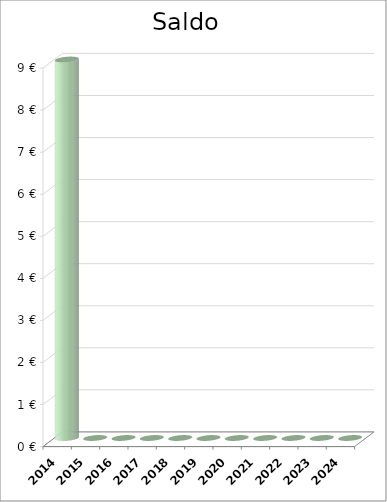
| Category | Saldo |
|---|---|
| 2014.0 | 9 |
| 2015.0 | 0 |
| 2016.0 | 0 |
| 2017.0 | 0 |
| 2018.0 | 0 |
| 2019.0 | 0 |
| 2020.0 | 0 |
| 2021.0 | 0 |
| 2022.0 | 0 |
| 2023.0 | 0 |
| 2024.0 | 0 |